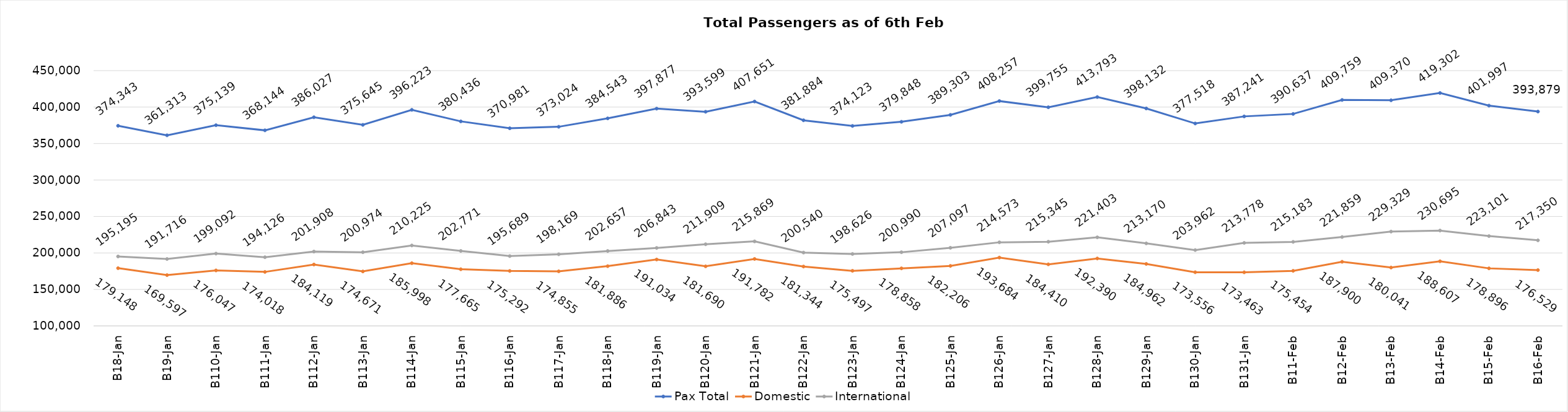
| Category | Pax Total | Domestic | International |
|---|---|---|---|
| 2024-01-08 | 374343 | 179148 | 195195 |
| 2024-01-09 | 361313 | 169597 | 191716 |
| 2024-01-10 | 375139 | 176047 | 199092 |
| 2024-01-11 | 368144 | 174018 | 194126 |
| 2024-01-12 | 386027 | 184119 | 201908 |
| 2024-01-13 | 375645 | 174671 | 200974 |
| 2024-01-14 | 396223 | 185998 | 210225 |
| 2024-01-15 | 380436 | 177665 | 202771 |
| 2024-01-16 | 370981 | 175292 | 195689 |
| 2024-01-17 | 373024 | 174855 | 198169 |
| 2024-01-18 | 384543 | 181886 | 202657 |
| 2024-01-19 | 397877 | 191034 | 206843 |
| 2024-01-20 | 393599 | 181690 | 211909 |
| 2024-01-21 | 407651 | 191782 | 215869 |
| 2024-01-22 | 381884 | 181344 | 200540 |
| 2024-01-23 | 374123 | 175497 | 198626 |
| 2024-01-24 | 379848 | 178858 | 200990 |
| 2024-01-25 | 389303 | 182206 | 207097 |
| 2024-01-26 | 408257 | 193684 | 214573 |
| 2024-01-27 | 399755 | 184410 | 215345 |
| 2024-01-28 | 413793 | 192390 | 221403 |
| 2024-01-29 | 398132 | 184962 | 213170 |
| 2024-01-30 | 377518 | 173556 | 203962 |
| 2024-01-31 | 387241 | 173463 | 213778 |
| 2024-02-01 | 390637 | 175454 | 215183 |
| 2024-02-02 | 409759 | 187900 | 221859 |
| 2024-02-03 | 409370 | 180041 | 229329 |
| 2024-02-04 | 419302 | 188607 | 230695 |
| 2024-02-05 | 401997 | 178896 | 223101 |
| 2024-02-06 | 393879 | 176529 | 217350 |